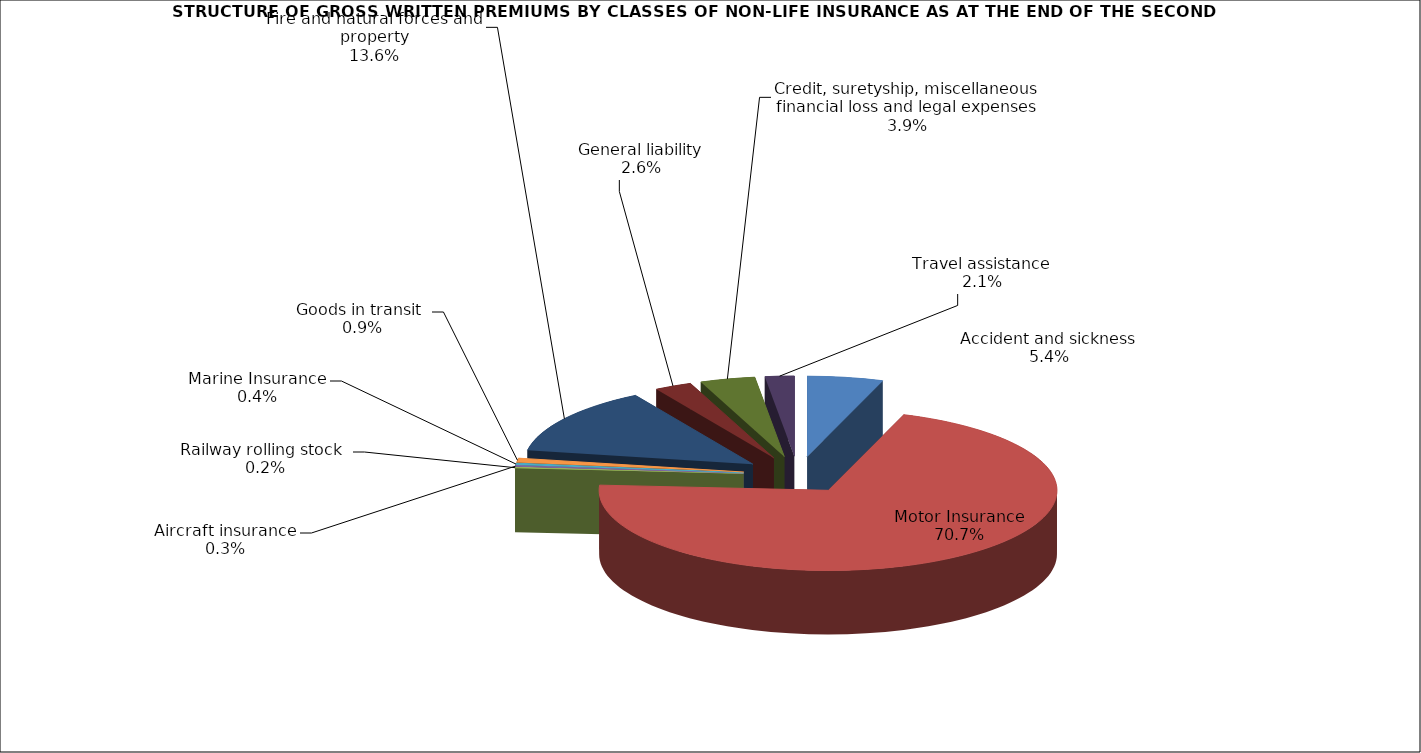
| Category | Accident and sickness |
|---|---|
| Accident and sickness | 0.054 |
| Motor Insurance | 0.707 |
| Railway rolling stock  | 0.002 |
| Aircraft insurance | 0.003 |
| Marine Insurance | 0.004 |
| Goods in transit  | 0.009 |
| Fire and natural forces and property | 0.136 |
| General liability | 0.026 |
| Credit, suretyship, miscellaneous financial loss and legal expenses | 0.039 |
| Travel assistance | 0.021 |